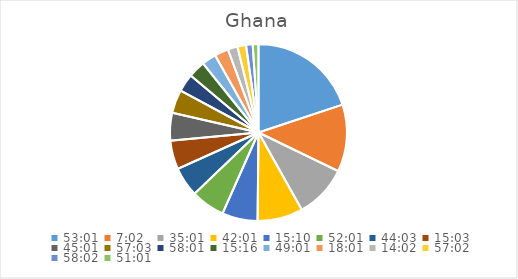
| Category | Series 0 |
|---|---|
| 2.2090277777777776 | 21.46 |
| 0.29305555555555557 | 13.235 |
| 1.4590277777777778 | 10.44 |
| 1.7506944444444443 | 8.95 |
| 0.6319444444444444 | 6.996 |
| 2.167361111111111 | 6.686 |
| 1.8354166666666665 | 5.833 |
| 0.6270833333333333 | 5.665 |
| 1.8756944444444443 | 5.446 |
| 2.377083333333333 | 4.629 |
| 2.417361111111111 | 3.501 |
| 0.6361111111111112 | 3.356 |
| 2.042361111111111 | 2.826 |
| 0.7506944444444444 | 2.73 |
| 0.5847222222222223 | 1.924 |
| 2.3763888888888887 | 1.689 |
| 2.4180555555555556 | 1.316 |
| 2.1256944444444446 | 1.13 |